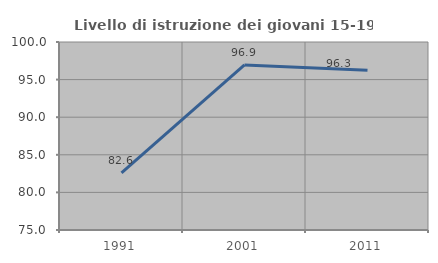
| Category | Livello di istruzione dei giovani 15-19 anni |
|---|---|
| 1991.0 | 82.584 |
| 2001.0 | 96.947 |
| 2011.0 | 96.25 |